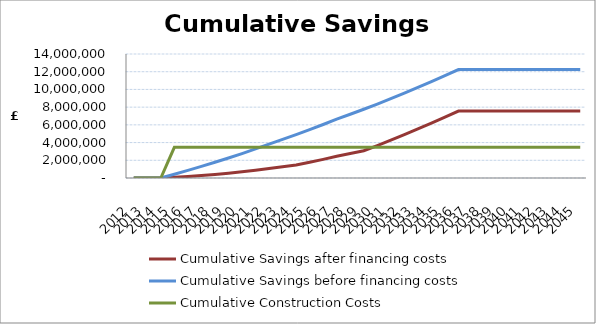
| Category | Cumulative Savings after financing costs | Cumulative Savings before financing costs | Cumulative Construction Costs |
|---|---|---|---|
| 2012.0 | 0 | 0 | 0 |
| 2013.0 | 0 | 0 | 0 |
| 2014.0 | 0 | 0 | 0 |
| 2015.0 | 80376.973 | 424156.272 | 3468087.709 |
| 2016.0 | 174752.674 | 862311.272 | 3468087.709 |
| 2017.0 | 282211.258 | 1313549.155 | 3468087.709 |
| 2018.0 | 401993.144 | 1777110.34 | 3468087.709 |
| 2019.0 | 537632.062 | 2256528.557 | 3468087.709 |
| 2020.0 | 697529.284 | 2760205.078 | 3468087.709 |
| 2021.0 | 880319.809 | 3286774.901 | 3468087.709 |
| 2022.0 | 1082934.692 | 3833169.084 | 3468087.709 |
| 2023.0 | 1258969.999 | 4352983.69 | 3468087.709 |
| 2024.0 | 1459609.927 | 4897402.916 | 3468087.709 |
| 2025.0 | 1775644.411 | 5462976.3 | 3468087.709 |
| 2026.0 | 2106273.94 | 6043144.729 | 3468087.709 |
| 2027.0 | 2458537.504 | 6644947.193 | 3468087.709 |
| 2028.0 | 2759696.078 | 7195644.667 | 3468087.709 |
| 2029.0 | 3074402.507 | 7759889.995 | 3468087.709 |
| 2030.0 | 3655982.209 | 8341469.698 | 3468087.709 |
| 2031.0 | 4267879.086 | 8953366.574 | 3468087.709 |
| 2032.0 | 4894778 | 9580265.488 | 3468087.709 |
| 2033.0 | 5537054.003 | 10222541.491 | 3468087.709 |
| 2034.0 | 6195091.521 | 10880579.01 | 3468087.709 |
| 2035.0 | 6869329.405 | 11554816.894 | 3468087.709 |
| 2036.0 | 7560127.852 | 12245615.34 | 3468087.709 |
| 2037.0 | 7560127.852 | 12245615.34 | 3468087.709 |
| 2038.0 | 7560127.852 | 12245615.34 | 3468087.709 |
| 2039.0 | 7560127.852 | 12245615.34 | 3468087.709 |
| 2040.0 | 7560127.852 | 12245615.34 | 3468087.709 |
| 2041.0 | 7560127.852 | 12245615.34 | 3468087.709 |
| 2042.0 | 7560127.852 | 12245615.34 | 3468087.709 |
| 2043.0 | 7560127.852 | 12245615.34 | 3468087.709 |
| 2044.0 | 7560127.852 | 12245615.34 | 3468087.709 |
| 2045.0 | 7560127.852 | 12245615.34 | 3468087.709 |